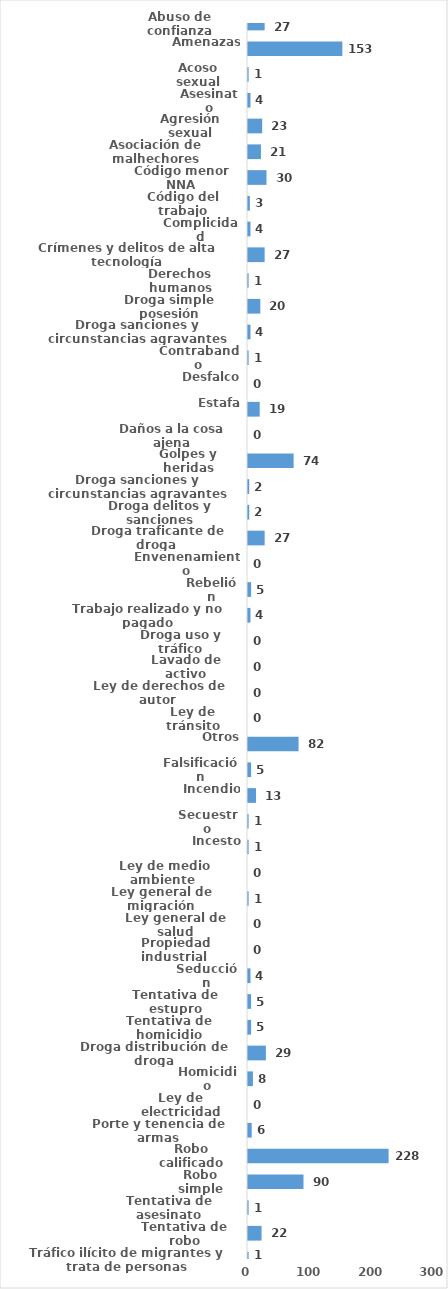
| Category | Series 0 |
|---|---|
| Abuso de confianza | 27 |
| Amenazas | 153 |
| Acoso sexual | 1 |
| Asesinato | 4 |
| Agresión sexual | 23 |
| Asociación de malhechores | 21 |
| Código menor NNA | 30 |
| Código del trabajo | 3 |
| Complicidad | 4 |
| Crímenes y delitos de alta tecnología | 27 |
| Derechos humanos | 1 |
| Droga simple posesión | 20 |
| Droga sanciones y circunstancias agravantes | 4 |
| Contrabando | 1 |
| Desfalco | 0 |
| Estafa | 19 |
| Daños a la cosa ajena | 0 |
| Golpes y heridas | 74 |
| Droga sanciones y circunstancias agravantes | 2 |
| Droga delitos y sanciones | 2 |
| Droga traficante de droga  | 27 |
| Envenenamiento | 0 |
| Rebelión | 5 |
| Trabajo realizado y no pagado | 4 |
| Droga uso y tráfico | 0 |
| Lavado de activo | 0 |
| Ley de derechos de autor  | 0 |
| Ley de tránsito | 0 |
| Otros | 82 |
| Falsificación | 5 |
| Incendio | 13 |
| Secuestro | 1 |
| Incesto | 1 |
| Ley de medio ambiente  | 0 |
| Ley general de migración | 1 |
| Ley general de salud | 0 |
| Propiedad industrial  | 0 |
| Seducción | 4 |
| Tentativa de estupro | 5 |
| Tentativa de homicidio | 5 |
| Droga distribución de droga | 29 |
| Homicidio | 8 |
| Ley de electricidad | 0 |
| Porte y tenencia de armas | 6 |
| Robo calificado | 228 |
| Robo simple | 90 |
| Tentativa de asesinato | 1 |
| Tentativa de robo | 22 |
| Tráfico ilícito de migrantes y trata de personas | 1 |